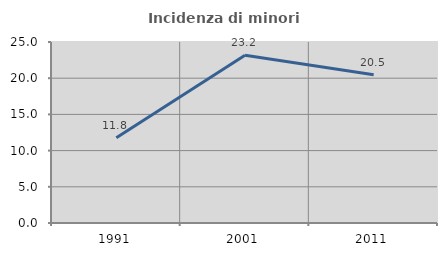
| Category | Incidenza di minori stranieri |
|---|---|
| 1991.0 | 11.765 |
| 2001.0 | 23.158 |
| 2011.0 | 20.47 |